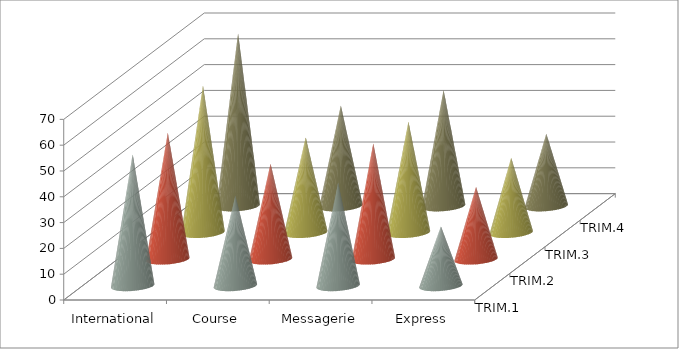
| Category | TRIM.1 | TRIM.2 | TRIM.3 | TRIM.4 |
|---|---|---|---|---|
| International | 51 | 49 | 57 | 67 |
| Course | 35 | 37 | 37 | 39 |
| Messagerie | 40 | 45 | 43 | 45 |
| Express | 23 | 28 | 29 | 28 |